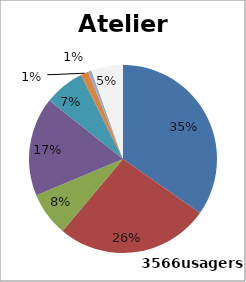
| Category | Series 0 |
|---|---|
| 0 | 34.745 |
| 1 | 26.36 |
| 2 | 7.6 |
| 3 | 16.966 |
| 4 | 6.955 |
| 5 | 1.346 |
| 6 | 0.561 |
| 7 | 5.468 |